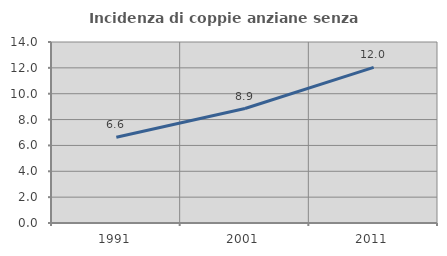
| Category | Incidenza di coppie anziane senza figli  |
|---|---|
| 1991.0 | 6.628 |
| 2001.0 | 8.856 |
| 2011.0 | 12.039 |